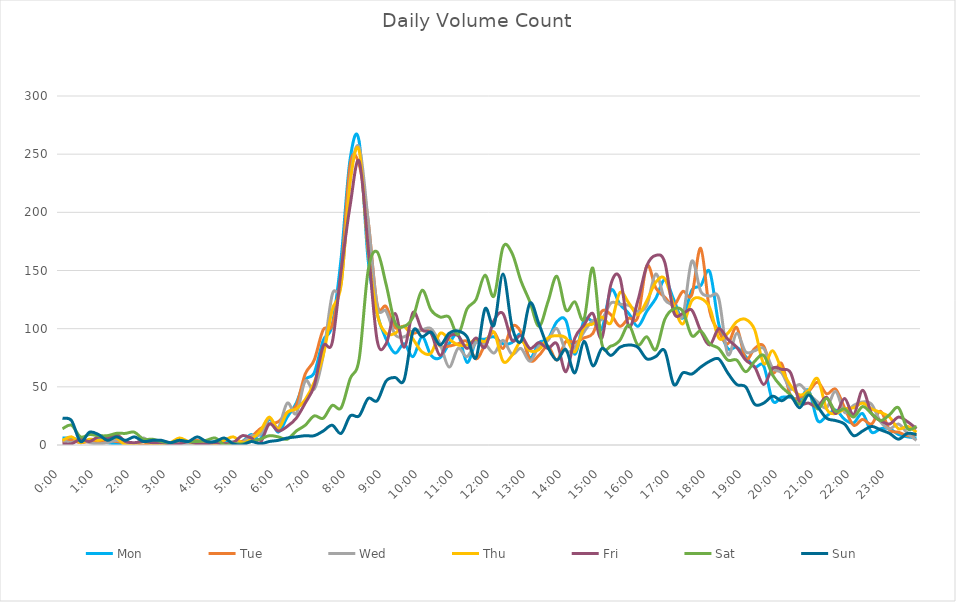
| Category | Mon | Tue | Wed | Thu | Fri | Sat | Sun |
|---|---|---|---|---|---|---|---|
| 0.0 | 6 | 3 | 4 | 4 | 1 | 14 | 23 |
| 0.010416666666666666 | 6 | 4 | 2 | 7 | 1 | 17 | 21 |
| 0.020833333333333332 | 4 | 2 | 5 | 2 | 5 | 7 | 3 |
| 0.03125 | 3 | 3 | 2 | 5 | 3 | 9 | 11 |
| 0.041666666666666664 | 6 | 2 | 1 | 4 | 7 | 8 | 9 |
| 0.05208333333333333 | 2 | 4 | 2 | 6 | 6 | 8 | 4 |
| 0.06249999999999999 | 1 | 3 | 4 | 6 | 9 | 10 | 7 |
| 0.07291666666666666 | 0 | 2 | 2 | 0 | 3 | 10 | 4 |
| 0.08333333333333333 | 1 | 0 | 0 | 1 | 2 | 11 | 7 |
| 0.09375 | 3 | 0 | 6 | 3 | 3 | 5 | 3 |
| 0.10416666666666667 | 1 | 2 | 1 | 1 | 2 | 5 | 4 |
| 0.11458333333333334 | 1 | 3 | 2 | 1 | 2 | 3 | 4 |
| 0.125 | 1 | 2 | 0 | 2 | 1 | 2 | 2 |
| 0.13541666666666666 | 1 | 1 | 1 | 6 | 1 | 4 | 4 |
| 0.14583333333333331 | 2 | 2 | 1 | 3 | 3 | 3 | 3 |
| 0.15624999999999997 | 1 | 4 | 1 | 1 | 1 | 3 | 7 |
| 0.16666666666666663 | 1 | 1 | 3 | 1 | 1 | 4 | 3 |
| 0.1770833333333333 | 3 | 2 | 0 | 1 | 2 | 6 | 3 |
| 0.18749999999999994 | 3 | 1 | 0 | 4 | 1 | 0 | 6 |
| 0.1979166666666666 | 2 | 2 | 3 | 7 | 2 | 1 | 1 |
| 0.20833333333333326 | 3 | 3 | 2 | 2 | 8 | 1 | 0 |
| 0.21874999999999992 | 9 | 7 | 8 | 5 | 6 | 3 | 3 |
| 0.22916666666666657 | 5 | 14 | 9 | 12 | 2 | 5 | 1 |
| 0.23958333333333323 | 22 | 18 | 23 | 24 | 18 | 8 | 3 |
| 0.2499999999999999 | 11 | 20 | 15 | 14 | 12 | 7 | 4 |
| 0.2604166666666666 | 24 | 28 | 36 | 28 | 16 | 5 | 6 |
| 0.27083333333333326 | 36 | 34 | 27 | 31 | 23 | 12 | 7 |
| 0.28124999999999994 | 56 | 61 | 55 | 39 | 36 | 17 | 8 |
| 0.29166666666666663 | 62 | 73 | 48 | 54 | 51 | 25 | 8 |
| 0.3020833333333333 | 90 | 99 | 77 | 77 | 85 | 23 | 12 |
| 0.3125 | 103 | 103 | 129 | 116 | 88 | 34 | 17 |
| 0.3229166666666667 | 161 | 148 | 139 | 138 | 150 | 32 | 10 |
| 0.33333333333333337 | 246 | 241 | 229 | 226 | 206 | 57 | 25 |
| 0.34375000000000006 | 261 | 241 | 256 | 253 | 244 | 74 | 25 |
| 0.35416666666666674 | 159 | 193 | 193 | 167 | 170 | 150 | 40 |
| 0.3645833333333334 | 113 | 121 | 120 | 113 | 90 | 166 | 38 |
| 0.3750000000000001 | 91 | 119 | 115 | 96 | 87 | 138 | 55 |
| 0.3854166666666668 | 79 | 101 | 95 | 96 | 113 | 105 | 58 |
| 0.3958333333333335 | 87 | 102 | 93 | 102 | 84 | 102 | 56 |
| 0.40625000000000017 | 76 | 96 | 98 | 91 | 114 | 110 | 98 |
| 0.41666666666666685 | 93 | 99 | 99 | 80 | 99 | 133 | 93 |
| 0.4270833333333333 | 77 | 97 | 100 | 79 | 96 | 116 | 97 |
| 0.4375000000000002 | 75 | 85 | 87 | 96 | 77 | 110 | 86 |
| 0.4479166666666669 | 87 | 85 | 67 | 91 | 93 | 110 | 96 |
| 0.4583333333333333 | 95 | 87 | 83 | 86 | 94 | 95 | 98 |
| 0.4687500000000003 | 71 | 89 | 76 | 86 | 83 | 117 | 93 |
| 0.47916666666666696 | 89 | 74 | 88 | 91 | 92 | 125 | 75 |
| 0.4895833333333333 | 91 | 86 | 87 | 89 | 84 | 146 | 117 |
| 0.5000000000000003 | 93 | 97 | 79 | 97 | 107 | 128 | 103 |
| 0.510416666666667 | 87 | 83 | 90 | 72 | 113 | 170 | 147 |
| 0.5208333333333334 | 88 | 102 | 78 | 77 | 90 | 165 | 102 |
| 0.5312500000000002 | 95 | 97 | 83 | 89 | 94 | 141 | 89 |
| 0.5416666666666669 | 75 | 73 | 72 | 81 | 83 | 123 | 122 |
| 0.5520833333333335 | 88 | 77 | 85 | 82 | 88 | 102 | 104 |
| 0.5625000000000001 | 91 | 85 | 90 | 92 | 83 | 123 | 84 |
| 0.5729166666666667 | 106 | 73 | 100 | 94 | 87 | 145 | 73 |
| 0.5833333333333334 | 107 | 89 | 81 | 92 | 63 | 116 | 82 |
| 0.59375 | 78 | 88 | 84 | 80 | 92 | 123 | 62 |
| 0.6041666666666666 | 107 | 92 | 97 | 101 | 103 | 108 | 89 |
| 0.6145833333333333 | 106 | 96 | 107 | 104 | 113 | 152 | 68 |
| 0.6249999999999999 | 100 | 115 | 108 | 110 | 92 | 87 | 83 |
| 0.6354166666666665 | 133 | 112 | 122 | 105 | 138 | 85 | 77 |
| 0.6458333333333331 | 121 | 102 | 121 | 131 | 144 | 90 | 84 |
| 0.6562499999999998 | 113 | 109 | 120 | 122 | 102 | 103 | 86 |
| 0.6666666666666666 | 102 | 110 | 115 | 112 | 124 | 86 | 84 |
| 0.677083333333333 | 115 | 154 | 120 | 124 | 154 | 93 | 74 |
| 0.6874999999999997 | 126 | 135 | 147 | 140 | 163 | 82 | 76 |
| 0.6979166666666666 | 142 | 127 | 125 | 143 | 157 | 108 | 81 |
| 0.7083333333333329 | 125 | 120 | 120 | 120 | 114 | 117 | 52 |
| 0.7187499999999996 | 109 | 132 | 111 | 104 | 113 | 115 | 62 |
| 0.7291666666666666 | 133 | 129 | 158 | 124 | 116 | 94 | 61 |
| 0.7395833333333328 | 137 | 169 | 132 | 126 | 98 | 98 | 67 |
| 0.75 | 149 | 115 | 128 | 118 | 86 | 87 | 72 |
| 0.7604166666666666 | 104 | 98 | 126 | 92 | 100 | 83 | 74 |
| 0.7708333333333327 | 83 | 87 | 78 | 96 | 91 | 73 | 62 |
| 0.78125 | 84 | 101 | 96 | 106 | 84 | 73 | 52 |
| 0.7916666666666666 | 76 | 74 | 80 | 108 | 73 | 63 | 50 |
| 0.8020833333333326 | 67 | 83 | 81 | 99 | 67 | 72 | 35 |
| 0.8125 | 68 | 85 | 83 | 70 | 52 | 77 | 36 |
| 0.8229166666666666 | 38 | 62 | 66 | 81 | 66 | 60 | 42 |
| 0.8333333333333334 | 41 | 70 | 62 | 65 | 65 | 50 | 38 |
| 0.84375 | 41 | 42 | 48 | 51 | 62 | 43 | 42 |
| 0.8541666666666666 | 39 | 41 | 52 | 43 | 37 | 35 | 32 |
| 0.8645833333333334 | 47 | 46 | 44 | 47 | 36 | 45 | 43 |
| 0.875 | 21 | 54 | 37 | 57 | 33 | 31 | 33 |
| 0.8854166666666666 | 25 | 44 | 32 | 31 | 41 | 40 | 23 |
| 0.8958333333333334 | 30 | 48 | 46 | 27 | 27 | 29 | 21 |
| 0.90625 | 22 | 32 | 28 | 31 | 40 | 31 | 18 |
| 0.9166666666666666 | 19 | 17 | 34 | 32 | 26 | 24 | 8 |
| 0.9270833333333334 | 27 | 22 | 37 | 36 | 47 | 33 | 12 |
| 0.9375 | 11 | 18 | 35 | 31 | 27 | 27 | 16 |
| 0.9479166666666666 | 14 | 29 | 20 | 28 | 21 | 21 | 13 |
| 0.9583333333333334 | 14 | 13 | 14 | 24 | 18 | 26 | 10 |
| 0.96875 | 9 | 11 | 18 | 14 | 24 | 32 | 5 |
| 0.9791666666666666 | 7 | 8 | 10 | 16 | 20 | 14 | 10 |
| 0.9895833333333334 | 6 | 9 | 4 | 11 | 14 | 16 | 9 |